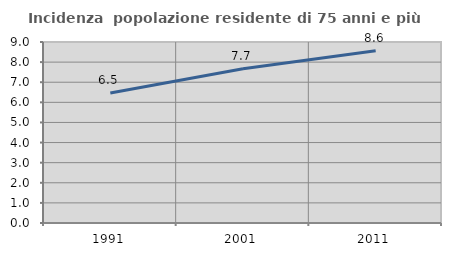
| Category | Incidenza  popolazione residente di 75 anni e più |
|---|---|
| 1991.0 | 6.459 |
| 2001.0 | 7.667 |
| 2011.0 | 8.568 |